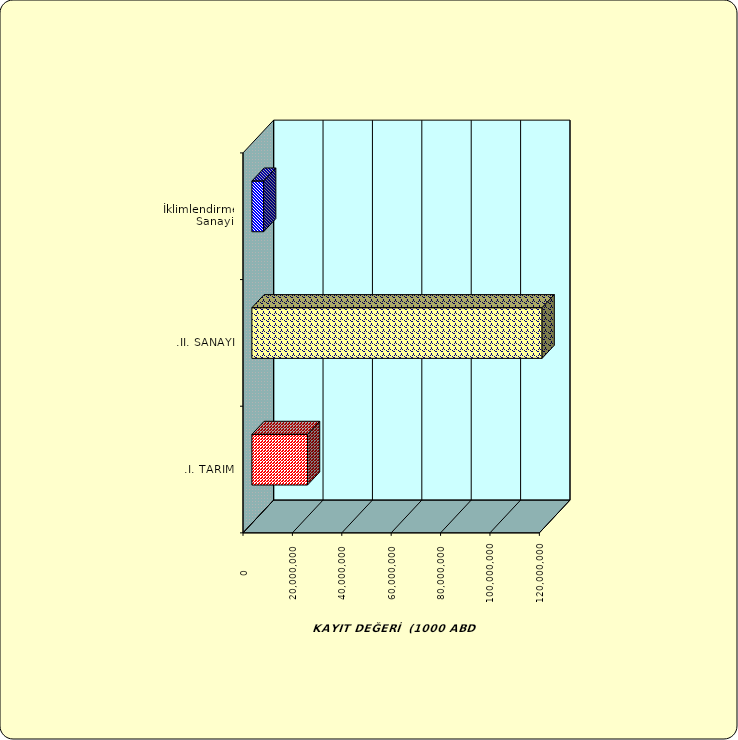
| Category | Series 0 |
|---|---|
| .I. TARIM | 22526819.688 |
| .II. SANAYİ | 117499749.583 |
|  İklimlendirme Sanayii | 4755843.602 |